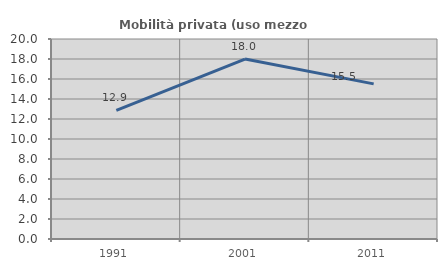
| Category | Mobilità privata (uso mezzo privato) |
|---|---|
| 1991.0 | 12.871 |
| 2001.0 | 17.997 |
| 2011.0 | 15.512 |